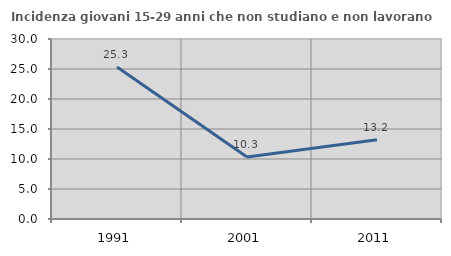
| Category | Incidenza giovani 15-29 anni che non studiano e non lavorano  |
|---|---|
| 1991.0 | 25.333 |
| 2001.0 | 10.345 |
| 2011.0 | 13.191 |